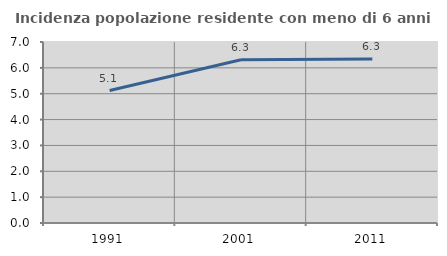
| Category | Incidenza popolazione residente con meno di 6 anni |
|---|---|
| 1991.0 | 5.123 |
| 2001.0 | 6.311 |
| 2011.0 | 6.341 |